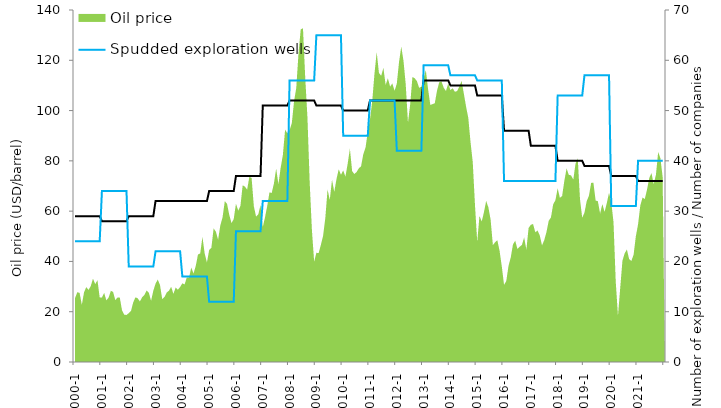
| Category | Number of companies on the shelf | Spudded exploration wells |
|---|---|---|
| 2000-1 | 29 | 24 |
| 2000-2 | 29 | 24 |
| 2000-3 | 29 | 24 |
| 2000-4 | 29 | 24 |
| 2000-5 | 29 | 24 |
| 2000-6 | 29 | 24 |
| 2000-7 | 29 | 24 |
| 2000-8 | 29 | 24 |
| 2000-9 | 29 | 24 |
| 2000-10 | 29 | 24 |
| 2000-11 | 29 | 24 |
| 2000-12 | 29 | 24 |
| 2001-1 | 28 | 34 |
| 2001-2 | 28 | 34 |
| 2001-3 | 28 | 34 |
| 2001-4 | 28 | 34 |
| 2001-5 | 28 | 34 |
| 2001-6 | 28 | 34 |
| 2001-7 | 28 | 34 |
| 2001-8 | 28 | 34 |
| 2001-9 | 28 | 34 |
| 2001-10 | 28 | 34 |
| 2001-11 | 28 | 34 |
| 2001-12 | 28 | 34 |
| 2002-1 | 29 | 19 |
| 2002-2 | 29 | 19 |
| 2002-3 | 29 | 19 |
| 2002-4 | 29 | 19 |
| 2002-5 | 29 | 19 |
| 2002-6 | 29 | 19 |
| 2002-7 | 29 | 19 |
| 2002-8 | 29 | 19 |
| 2002-9 | 29 | 19 |
| 2002-10 | 29 | 19 |
| 2002-11 | 29 | 19 |
| 2002-12 | 29 | 19 |
| 2003-1 | 32 | 22 |
| 2003-2 | 32 | 22 |
| 2003-3 | 32 | 22 |
| 2003-4 | 32 | 22 |
| 2003-5 | 32 | 22 |
| 2003-6 | 32 | 22 |
| 2003-7 | 32 | 22 |
| 2003-8 | 32 | 22 |
| 2003-9 | 32 | 22 |
| 2003-10 | 32 | 22 |
| 2003-11 | 32 | 22 |
| 2003-12 | 32 | 22 |
| 2004-1 | 32 | 17 |
| 2004-2 | 32 | 17 |
| 2004-3 | 32 | 17 |
| 2004-4 | 32 | 17 |
| 2004-5 | 32 | 17 |
| 2004-6 | 32 | 17 |
| 2004-7 | 32 | 17 |
| 2004-8 | 32 | 17 |
| 2004-9 | 32 | 17 |
| 2004-10 | 32 | 17 |
| 2004-11 | 32 | 17 |
| 2004-12 | 32 | 17 |
| 2005-1 | 34 | 12 |
| 2005-2 | 34 | 12 |
| 2005-3 | 34 | 12 |
| 2005-4 | 34 | 12 |
| 2005-5 | 34 | 12 |
| 2005-6 | 34 | 12 |
| 2005-7 | 34 | 12 |
| 2005-8 | 34 | 12 |
| 2005-9 | 34 | 12 |
| 2005-10 | 34 | 12 |
| 2005-11 | 34 | 12 |
| 2005-12 | 34 | 12 |
| 2006-1 | 37 | 26 |
| 2006-2 | 37 | 26 |
| 2006-3 | 37 | 26 |
| 2006-4 | 37 | 26 |
| 2006-5 | 37 | 26 |
| 2006-6 | 37 | 26 |
| 2006-7 | 37 | 26 |
| 2006-8 | 37 | 26 |
| 2006-9 | 37 | 26 |
| 2006-10 | 37 | 26 |
| 2006-11 | 37 | 26 |
| 2006-12 | 37 | 26 |
| 2007-1 | 51 | 32 |
| 2007-2 | 51 | 32 |
| 2007-3 | 51 | 32 |
| 2007-4 | 51 | 32 |
| 2007-5 | 51 | 32 |
| 2007-6 | 51 | 32 |
| 2007-7 | 51 | 32 |
| 2007-8 | 51 | 32 |
| 2007-9 | 51 | 32 |
| 2007-10 | 51 | 32 |
| 2007-11 | 51 | 32 |
| 2007-12 | 51 | 32 |
| 2008-1 | 52 | 56 |
| 2008-2 | 52 | 56 |
| 2008-3 | 52 | 56 |
| 2008-4 | 52 | 56 |
| 2008-5 | 52 | 56 |
| 2008-6 | 52 | 56 |
| 2008-7 | 52 | 56 |
| 2008-8 | 52 | 56 |
| 2008-9 | 52 | 56 |
| 2008-10 | 52 | 56 |
| 2008-11 | 52 | 56 |
| 2008-12 | 52 | 56 |
| 2009-1 | 51 | 65 |
| 2009-2 | 51 | 65 |
| 2009-3 | 51 | 65 |
| 2009-4 | 51 | 65 |
| 2009-5 | 51 | 65 |
| 2009-6 | 51 | 65 |
| 2009-7 | 51 | 65 |
| 2009-8 | 51 | 65 |
| 2009-9 | 51 | 65 |
| 2009-10 | 51 | 65 |
| 2009-11 | 51 | 65 |
| 2009-12 | 51 | 65 |
| 2010-1 | 50 | 45 |
| 2010-2 | 50 | 45 |
| 2010-3 | 50 | 45 |
| 2010-4 | 50 | 45 |
| 2010-5 | 50 | 45 |
| 2010-6 | 50 | 45 |
| 2010-7 | 50 | 45 |
| 2010-8 | 50 | 45 |
| 2010-9 | 50 | 45 |
| 2010-10 | 50 | 45 |
| 2010-11 | 50 | 45 |
| 2010-12 | 50 | 45 |
| 2011-1 | 52 | 52 |
| 2011-2 | 52 | 52 |
| 2011-3 | 52 | 52 |
| 2011-4 | 52 | 52 |
| 2011-5 | 52 | 52 |
| 2011-6 | 52 | 52 |
| 2011-7 | 52 | 52 |
| 2011-8 | 52 | 52 |
| 2011-9 | 52 | 52 |
| 2011-10 | 52 | 52 |
| 2011-11 | 52 | 52 |
| 2011-12 | 52 | 52 |
| 2012-1 | 52 | 42 |
| 2012-2 | 52 | 42 |
| 2012-3 | 52 | 42 |
| 2012-4 | 52 | 42 |
| 2012-5 | 52 | 42 |
| 2012-6 | 52 | 42 |
| 2012-7 | 52 | 42 |
| 2012-8 | 52 | 42 |
| 2012-9 | 52 | 42 |
| 2012-10 | 52 | 42 |
| 2012-11 | 52 | 42 |
| 2012-12 | 52 | 42 |
| 2013-1 | 56 | 59 |
| 2013-2 | 56 | 59 |
| 2013-3 | 56 | 59 |
| 2013-4 | 56 | 59 |
| 2013-5 | 56 | 59 |
| 2013-6 | 56 | 59 |
| 2013-7 | 56 | 59 |
| 2013-8 | 56 | 59 |
| 2013-9 | 56 | 59 |
| 2013-10 | 56 | 59 |
| 2013-11 | 56 | 59 |
| 2013-12 | 56 | 59 |
| 2014-1 | 55 | 57 |
| 2014-2 | 55 | 57 |
| 2014-3 | 55 | 57 |
| 2014-4 | 55 | 57 |
| 2014-5 | 55 | 57 |
| 2014-6 | 55 | 57 |
| 2014-7 | 55 | 57 |
| 2014-8 | 55 | 57 |
| 2014-9 | 55 | 57 |
| 2014-10 | 55 | 57 |
| 2014-11 | 55 | 57 |
| 2014-12 | 55 | 57 |
| 2015-1 | 53 | 56 |
| 2015-2 | 53 | 56 |
| 2015-3 | 53 | 56 |
| 2015-4 | 53 | 56 |
| 2015-5 | 53 | 56 |
| 2015-6 | 53 | 56 |
| 2015-7 | 53 | 56 |
| 2015-8 | 53 | 56 |
| 2015-9 | 53 | 56 |
| 2015-10 | 53 | 56 |
| 2015-11 | 53 | 56 |
| 2015-12 | 53 | 56 |
| 2016-1 | 46 | 36 |
| 2016-2 | 46 | 36 |
| 2016-3 | 46 | 36 |
| 2016-4 | 46 | 36 |
| 2016-5 | 46 | 36 |
| 2016-6 | 46 | 36 |
| 2016-7 | 46 | 36 |
| 2016-8 | 46 | 36 |
| 2016-9 | 46 | 36 |
| 2016-10 | 46 | 36 |
| 2016-11 | 46 | 36 |
| 2016-12 | 46 | 36 |
| 2017-1 | 43 | 36 |
| 2017-2 | 43 | 36 |
| 2017-3 | 43 | 36 |
| 2017-4 | 43 | 36 |
| 2017-5 | 43 | 36 |
| 2017-6 | 43 | 36 |
| 2017-7 | 43 | 36 |
| 2017-8 | 43 | 36 |
| 2017-9 | 43 | 36 |
| 2017-10 | 43 | 36 |
| 2017-11 | 43 | 36 |
| 2017-12 | 43 | 36 |
| 2018-1 | 40 | 53 |
| 2018-2 | 40 | 53 |
| 2018-3 | 40 | 53 |
| 2018-4 | 40 | 53 |
| 2018-5 | 40 | 53 |
| 2018-6 | 40 | 53 |
| 2018-7 | 40 | 53 |
| 2018-8 | 40 | 53 |
| 2018-9 | 40 | 53 |
| 2018-10 | 40 | 53 |
| 2018-11 | 40 | 53 |
| 2018-12 | 40 | 53 |
| 2019-1 | 39 | 57 |
| 2019-2 | 39 | 57 |
| 2019-3 | 39 | 57 |
| 2019-4 | 39 | 57 |
| 2019-5 | 39 | 57 |
| 2019-6 | 39 | 57 |
| 2019-7 | 39 | 57 |
| 2019-8 | 39 | 57 |
| 2019-9 | 39 | 57 |
| 2019-10 | 39 | 57 |
| 2019-11 | 39 | 57 |
| 2019-12 | 39 | 57 |
| 2020-1 | 37 | 31 |
| 2020-2 | 37 | 31 |
| 2020-3 | 37 | 31 |
| 2020-4 | 37 | 31 |
| 2020-5 | 37 | 31 |
| 2020-6 | 37 | 31 |
| 2020-7 | 37 | 31 |
| 2020-8 | 37 | 31 |
| 2020-9 | 37 | 31 |
| 2020-10 | 37 | 31 |
| 2020-11 | 37 | 31 |
| 2020-12 | 37 | 31 |
| 2021-1 | 36 | 40 |
| 2021-2 | 36 | 40 |
| 2021-3 | 36 | 40 |
| 2021-4 | 36 | 40 |
| 2021-5 | 36 | 40 |
| 2021-6 | 36 | 40 |
| 2021-7 | 36 | 40 |
| 2021-8 | 36 | 40 |
| 2021-9 | 36 | 40 |
| 2021-10 | 36 | 40 |
| 2021-11 | 36 | 40 |
| 2021-12 | 36 | 40 |